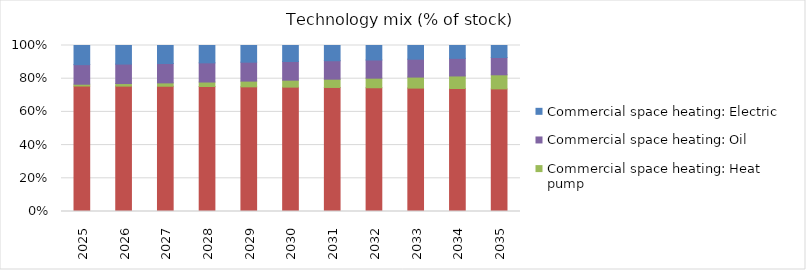
| Category | Commercial space heating: Gas | Commercial space heating: Heat pump | Commercial space heating: Oil | Commercial space heating: Electric |
|---|---|---|---|---|
| 2025.0 | 0.756 | 0.011 | 0.118 | 0.115 |
| 2026.0 | 0.755 | 0.015 | 0.117 | 0.112 |
| 2027.0 | 0.755 | 0.02 | 0.117 | 0.108 |
| 2028.0 | 0.753 | 0.027 | 0.115 | 0.105 |
| 2029.0 | 0.751 | 0.034 | 0.114 | 0.1 |
| 2030.0 | 0.749 | 0.042 | 0.113 | 0.096 |
| 2031.0 | 0.747 | 0.05 | 0.111 | 0.092 |
| 2032.0 | 0.745 | 0.058 | 0.11 | 0.087 |
| 2033.0 | 0.743 | 0.066 | 0.108 | 0.082 |
| 2034.0 | 0.741 | 0.075 | 0.106 | 0.077 |
| 2035.0 | 0.739 | 0.085 | 0.104 | 0.072 |